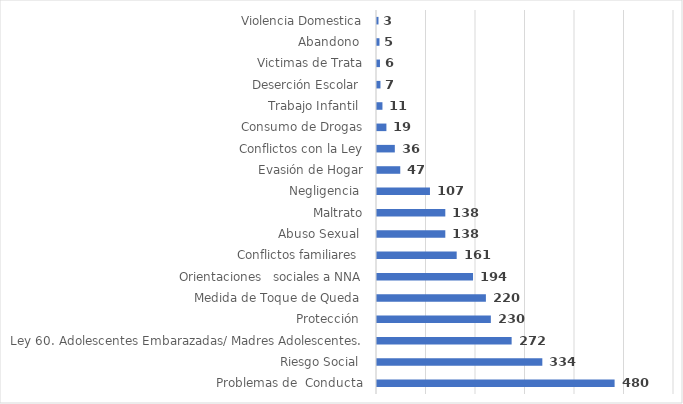
| Category | Series 0 |
|---|---|
| Problemas de  Conducta | 480 |
| Riesgo Social  | 334 |
| Ley 60. Adolescentes Embarazadas/ Madres Adolescentes. | 272 |
| Protección  | 230 |
| Medida de Toque de Queda  | 220 |
| Orientaciones   sociales a NNA | 194 |
| Conflictos familiares  | 161 |
| Abuso Sexual  | 138 |
| Maltrato | 138 |
| Negligencia  | 107 |
| Evasión de Hogar | 47 |
| Conflictos con la Ley | 36 |
| Consumo de Drogas | 19 |
| Trabajo Infantil  | 11 |
| Deserción Escolar  | 7 |
| Victimas de Trata | 6 |
| Abandono  | 5 |
| Violencia Domestica | 3 |